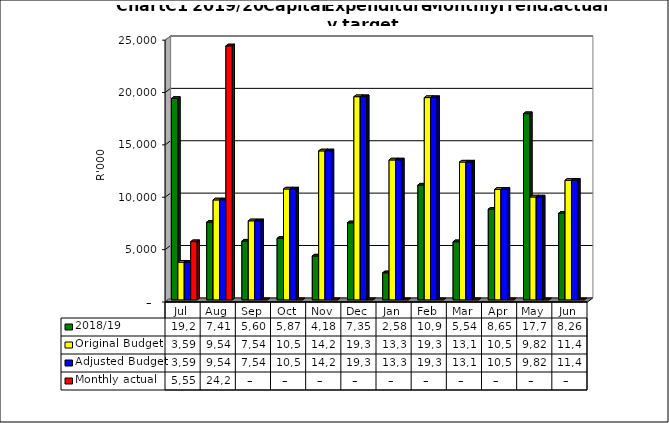
| Category | 2018/19 | Original Budget | Adjusted Budget | Monthly actual |
|---|---|---|---|---|
| Jul | 19231011.37 | 3597000 | 3597000 | 5554740.23 |
| Aug | 7413792.52 | 9540000 | 9540000 | 24246351.16 |
| Sep | 5606695.82 | 7545000 | 7545000 | 0 |
| Oct | 5872546.52 | 10583000 | 10583000 | 0 |
| Nov | 4185356.82 | 14220000 | 14220000 | 0 |
| Dec | 7353836.19 | 19396000 | 19396000 | 0 |
| Jan | 2583015.59 | 13356000 | 13356000 | 0 |
| Feb | 10959701.7 | 19309000 | 19309000 | 0 |
| Mar | 5548374.54 | 13155000 | 13155000 | 0 |
| Apr | 8654474.54 | 10547000 | 10547000 | 0 |
| May | 17774802.17 | 9821000 | 9821000 | 0 |
| Jun | 8264280 | 11417000 | 11417000 | 0 |